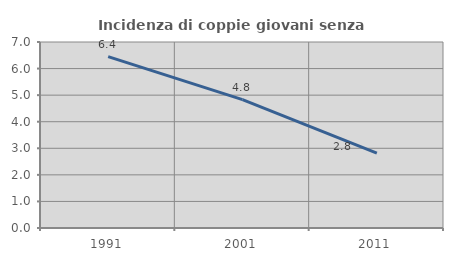
| Category | Incidenza di coppie giovani senza figli |
|---|---|
| 1991.0 | 6.448 |
| 2001.0 | 4.833 |
| 2011.0 | 2.817 |